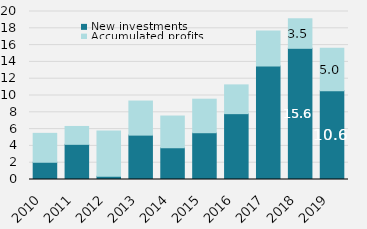
| Category | New investments | Accumulated profits |
|---|---|---|
| 0 | 2053 | 3440 |
| 1 | 4187 | 2127 |
| 2 | 386 | 5381 |
| 3 | 5283 | 4057 |
| 4 | 3779 | 3777 |
| 5 | 5569 | 3992 |
| 6 | 7839 | 3424 |
| 7 | 13511 | 4170 |
| 8 | 15618 | 3516 |
| 9 | 10566 | 5046 |